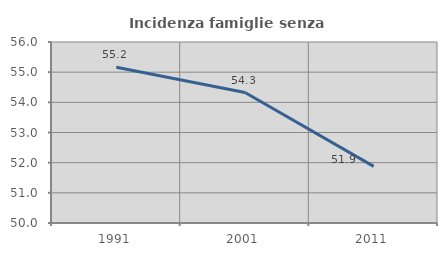
| Category | Incidenza famiglie senza nuclei |
|---|---|
| 1991.0 | 55.16 |
| 2001.0 | 54.325 |
| 2011.0 | 51.877 |